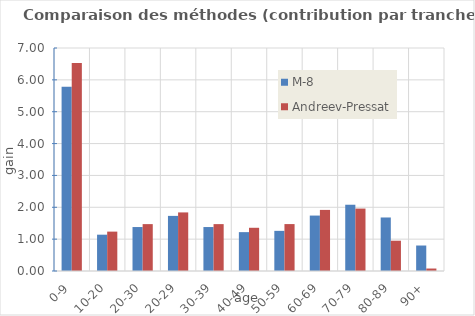
| Category | M-8 | Andreev-Pressat |
|---|---|---|
| 0-9 | 5.78 | 6.528 |
| 10-20 | 1.14 | 1.236 |
| 20-30 | 1.38 | 1.472 |
| 20-29 | 1.73 | 1.839 |
| 30-39 | 1.38 | 1.472 |
| 40-49 | 1.22 | 1.357 |
| 50-59 | 1.26 | 1.473 |
| 60-69 | 1.74 | 1.918 |
| 70-79 | 2.08 | 1.96 |
| 80-89 | 1.68 | 0.951 |
| 90+ | 0.8 | 0.078 |